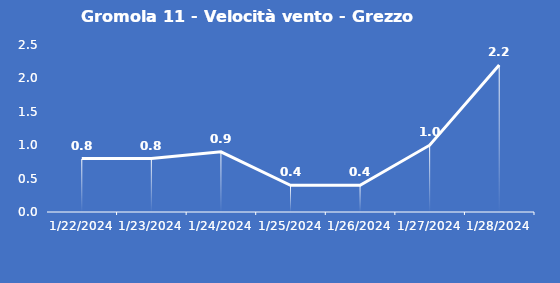
| Category | Gromola 11 - Velocità vento - Grezzo (m/s) |
|---|---|
| 1/22/24 | 0.8 |
| 1/23/24 | 0.8 |
| 1/24/24 | 0.9 |
| 1/25/24 | 0.4 |
| 1/26/24 | 0.4 |
| 1/27/24 | 1 |
| 1/28/24 | 2.2 |